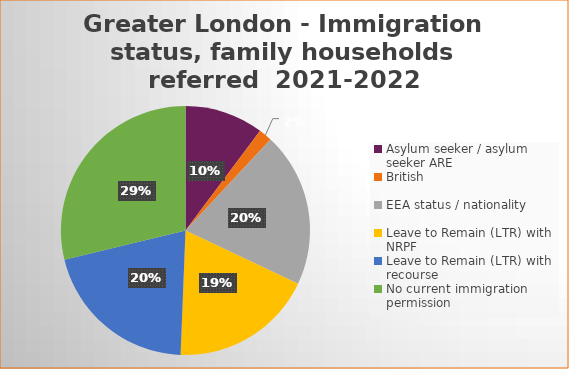
| Category | Number  | Percentage |
|---|---|---|
| Asylum seeker / asylum seeker ARE | 154 | 0.102 |
| British | 26 | 0.017 |
| EEA status / nationality  | 302 | 0.201 |
| Leave to Remain (LTR) with NRPF | 280 | 0.186 |
| Leave to Remain (LTR) with recourse | 310 | 0.2 |
| No current immigration permission | 433 | 0.288 |